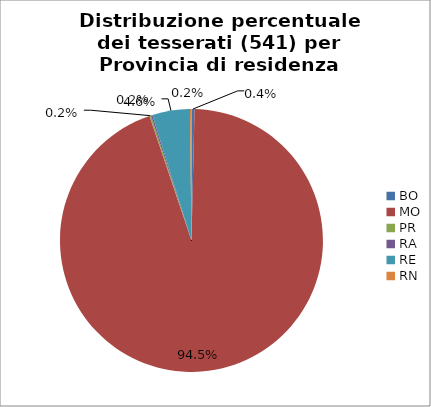
| Category | Nr. Tesserati |
|---|---|
| BO | 2 |
| MO | 511 |
| PR | 1 |
| RA | 1 |
| RE | 25 |
| RN | 1 |